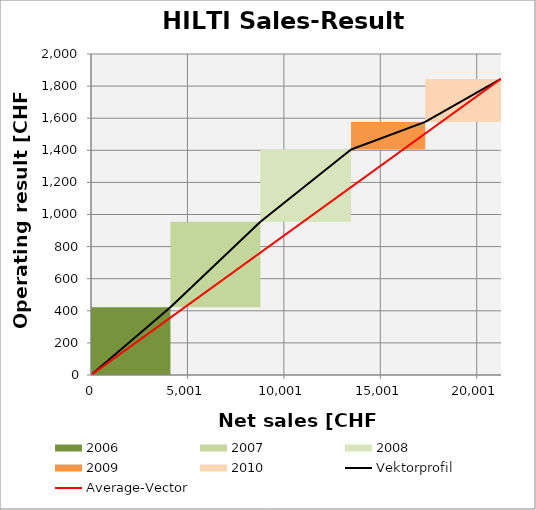
| Category | transparent | 2006 | 2007 | 2008 | 2009 | 2010 | none | Border right & top |
|---|---|---|---|---|---|---|---|---|
| 0.0 | 0 | 422 | 0 | 0 | 0 | 0 | 0 | 0 |
| 4118.0 | 0 | 422 | 0 | 0 | 0 | 0 | 0 | 0 |
| 4118.0 | 422 | 0 | 533 | 0 | 0 | 0 | 0 | 0 |
| 8785.0 | 422 | 0 | 533 | 0 | 0 | 0 | 0 | 0 |
| 8785.0 | 955 | 0 | 0 | 450 | 0 | 0 | 0 | 0 |
| 13485.0 | 955 | 0 | 0 | 450 | 0 | 0 | 0 | 0 |
| 13485.0 | 1405 | 0 | 0 | 0 | 172 | 0 | 0 | 0 |
| 17330.0 | 1405 | 0 | 0 | 0 | 172 | 0 | 0 | 0 |
| 17330.0 | 1577 | 0 | 0 | 0 | 0 | 268 | 0 | 0 |
| 21260.0 | 1577 | 0 | 0 | 0 | 0 | 268 | 0 | 0 |
| 21260.0 | 1845 | 0 | 0 | 0 | 0 | 0 | 0 | 0 |
| 21260.0 | 1845 | 0 | 0 | 0 | 0 | 0 | 0 | 0 |
| 21260.0 | 1845 | 0 | 0 | 0 | 0 | 0 | 0 | 0 |
| 21260.0 | 1845 | 0 | 0 | 0 | 0 | 0 | 0 | 0 |
| 21260.0 | 1845 | 0 | 0 | 0 | 0 | 0 | 0 | 0 |
| 21260.0 | 1845 | 0 | 0 | 0 | 0 | 0 | 0 | 0 |
| 21260.0 | 1845 | 0 | 0 | 0 | 0 | 0 | 0 | 0 |
| 21260.0 | 1845 | 0 | 0 | 0 | 0 | 0 | 0 | 0 |
| 21260.0 | 1845 | 0 | 0 | 0 | 0 | 0 | 0 | 0 |
| 21260.0 | 1845 | 0 | 0 | 0 | 0 | 0 | 0 | 0 |
| 21260.0 | 1845 | 0 | 0 | 0 | 0 | 0 | 0 | 0 |
| 21260.0 | 1845 | 0 | 0 | 0 | 0 | 0 | 0 | 0 |
| 21260.0 | 1845 | 0 | 0 | 0 | 0 | 0 | 0 | 0 |